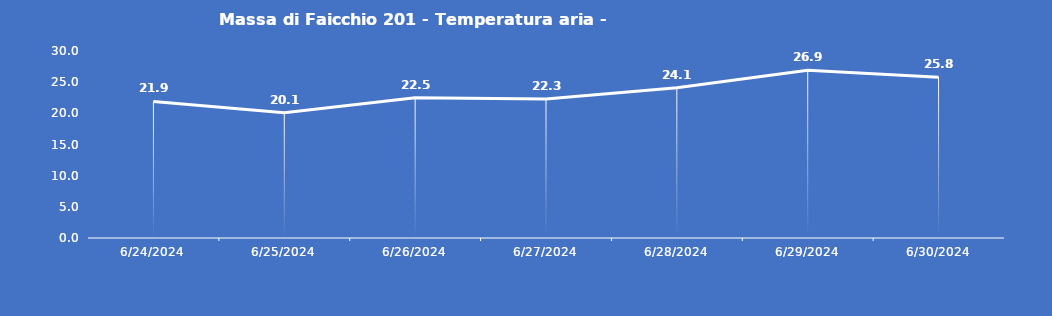
| Category | Massa di Faicchio 201 - Temperatura aria - Grezzo (°C) |
|---|---|
| 6/24/24 | 21.9 |
| 6/25/24 | 20.1 |
| 6/26/24 | 22.5 |
| 6/27/24 | 22.3 |
| 6/28/24 | 24.1 |
| 6/29/24 | 26.9 |
| 6/30/24 | 25.8 |